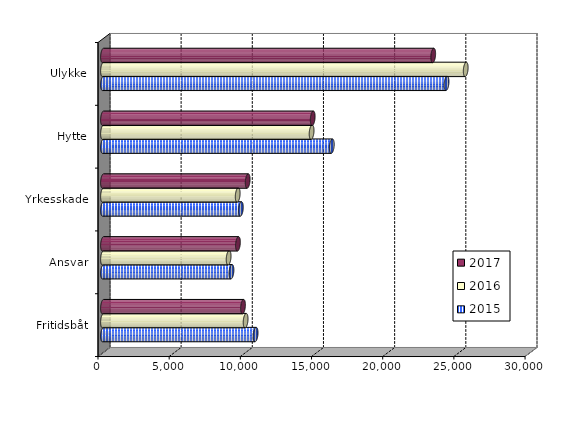
| Category | 2015 | 2016 | 2017 |
|---|---|---|---|
| Fritidsbåt | 10720.655 | 10018.849 | 9835.302 |
| Ansvar | 9026 | 8825.393 | 9480.052 |
| Yrkesskade | 9685 | 9463 | 10163.027 |
| Hytte | 16072.498 | 14653.807 | 14731.573 |
| Ulykke | 24133 | 25480.007 | 23196.56 |